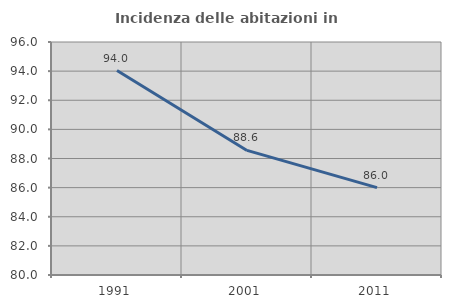
| Category | Incidenza delle abitazioni in proprietà  |
|---|---|
| 1991.0 | 94.04 |
| 2001.0 | 88.556 |
| 2011.0 | 86 |